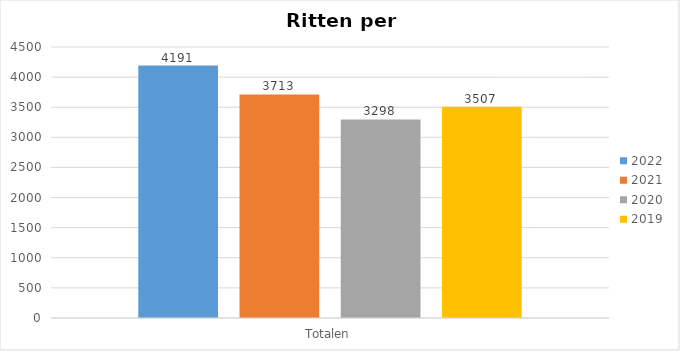
| Category | 2022 | 2021 | 2020 | 2019 |
|---|---|---|---|---|
| Totalen | 4191 | 3713 | 3298 | 3507 |